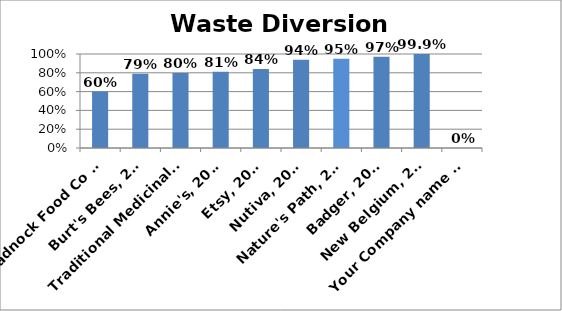
| Category | Diversion Rate |
|---|---|
| Monadnock Food Co Op, 2017 | 0.6 |
| Burt's Bees, 2016 | 0.79 |
| Traditional Medicinals, 2016 | 0.799 |
| Annie's, 2017 | 0.81 |
| Etsy, 2016 | 0.84 |
| Nutiva, 2015 | 0.94 |
| Nature's Path, 2016 | 0.95 |
| Badger, 2019 | 0.97 |
| New Belgium, 2017 | 0.999 |
| Your Company name here | 0 |